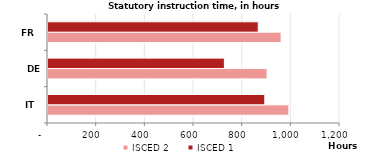
| Category | ISCED 2 | ISCED 1 |
|---|---|---|
| IT | 990 | 891 |
| DE | 900.423 | 724.94 |
| FR | 958 | 864 |